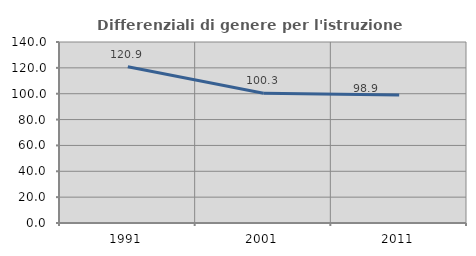
| Category | Differenziali di genere per l'istruzione superiore |
|---|---|
| 1991.0 | 120.851 |
| 2001.0 | 100.343 |
| 2011.0 | 98.922 |